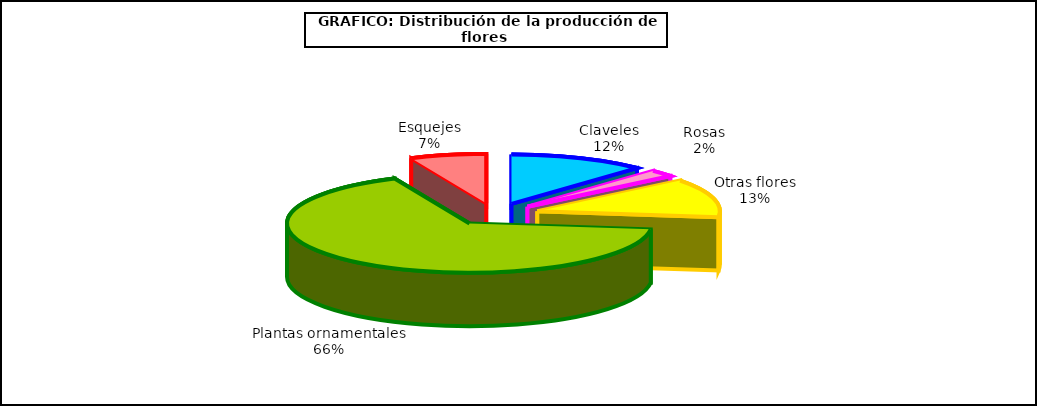
| Category | Series 0 |
|---|---|
| 0 | 46856 |
| 1 | 8682 |
| 2 | 48997 |
| 3 | 257751 |
| 4 | 26168 |